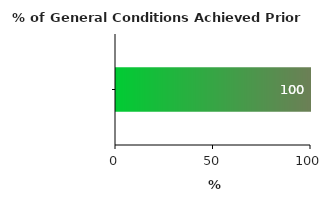
| Category | PROJ_IND_VAL |
|---|---|
| UR-L1016 | 100 |